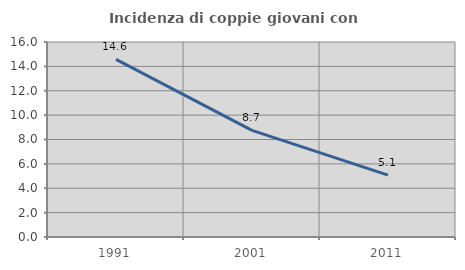
| Category | Incidenza di coppie giovani con figli |
|---|---|
| 1991.0 | 14.569 |
| 2001.0 | 8.748 |
| 2011.0 | 5.074 |